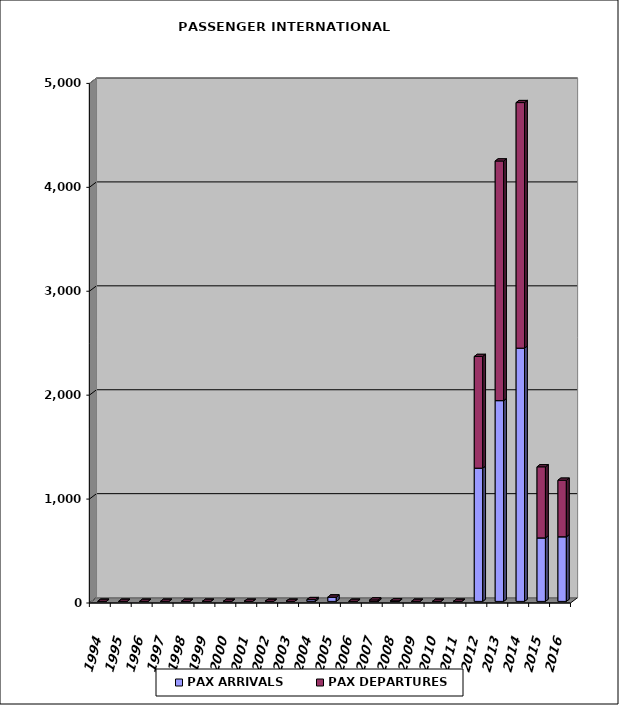
| Category | PAX ARRIVALS | PAX DEPARTURES |
|---|---|---|
| 1994.0 | 0 | 0 |
| 1995.0 | 0 | 0 |
| 1996.0 | 0 | 0 |
| 1997.0 | 0 | 0 |
| 1998.0 | 0 | 0 |
| 1999.0 | 0 | 0 |
| 2000.0 | 0 | 0 |
| 2001.0 | 0 | 0 |
| 2002.0 | 0 | 0 |
| 2003.0 | 0 | 0 |
| 2004.0 | 17 | 0 |
| 2005.0 | 41 | 0 |
| 2006.0 | 0 | 0 |
| 2007.0 | 0 | 14 |
| 2008.0 | 5 | 0 |
| 2009.0 | 0 | 0 |
| 2010.0 | 0 | 0 |
| 2011.0 | 0 | 0 |
| 2012.0 | 1282 | 1075 |
| 2013.0 | 1932 | 2306 |
| 2014.0 | 2437 | 2363 |
| 2015.0 | 611 | 684 |
| 2016.0 | 622 | 544 |